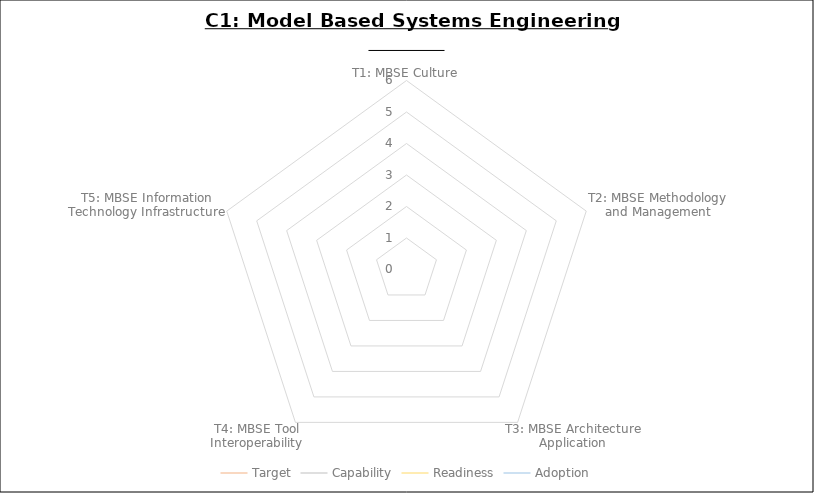
| Category | Target | Capability | Readiness | Adoption |
|---|---|---|---|---|
| T1: MBSE Culture | 0 | 0 | 0 | 0 |
| T2: MBSE Methodology and Management | 0 | 0 | 0 | 0 |
| T3: MBSE Architecture Application | 0 | 0 | 0 | 0 |
| T4: MBSE Tool Interoperability | 0 | 0 | 0 | 0 |
| T5: MBSE Information Technology Infrastructure | 0 | 0 | 0 | 0 |